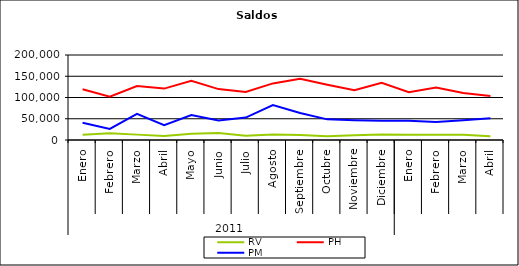
| Category | RV | PH | PM |
|---|---|---|---|
| 0 | 12486.559 | 119257.974 | 40482.239 |
| 1 | 15889.322 | 101672.556 | 26125.459 |
| 2 | 12648.212 | 127120.979 | 61476.373 |
| 3 | 9305.119 | 120918.649 | 34600.061 |
| 4 | 14743.308 | 139181.515 | 58520.526 |
| 5 | 16400.383 | 119786.743 | 45898.669 |
| 6 | 10237.415 | 112984.941 | 52796.29 |
| 7 | 13187.554 | 133150.287 | 82153.993 |
| 8 | 11812.311 | 144167.365 | 63539.661 |
| 9 | 9011.007 | 130152.402 | 48540.463 |
| 10 | 11220.046 | 117016.56 | 46576.47 |
| 11 | 12740.8 | 134738.539 | 45497.089 |
| 12 | 12341.813 | 112514.179 | 45537.16 |
| 13 | 12237.077 | 123774.486 | 42503.398 |
| 14 | 12097.047 | 110658.975 | 46279.761 |
| 15 | 8763.382 | 103284.021 | 51222.341 |